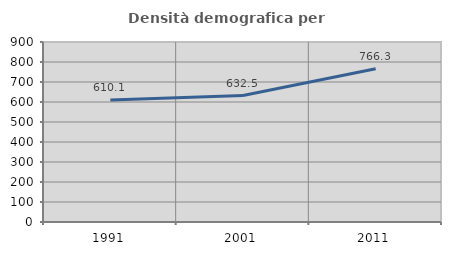
| Category | Densità demografica |
|---|---|
| 1991.0 | 610.116 |
| 2001.0 | 632.497 |
| 2011.0 | 766.329 |